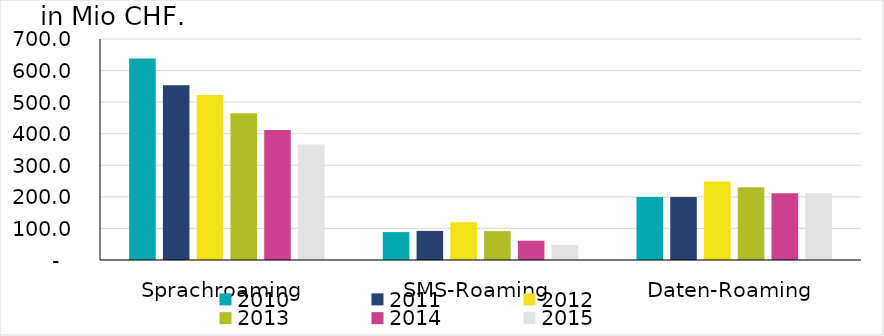
| Category | 2010 | 2011 | 2012 | 2013 | 2014 | 2015 |
|---|---|---|---|---|---|---|
| Sprachroaming | 638.374 | 553.668 | 522.689 | 464.834 | 411.566 | 365.936 |
| SMS-Roaming | 88.383 | 92.169 | 119.294 | 91.344 | 61.011 | 47.347 |
| Daten-Roaming | 199.16 | 199.573 | 248.416 | 230.172 | 211.707 | 211.605 |